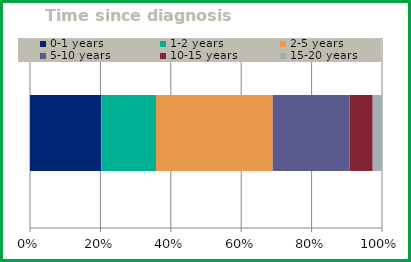
| Category | 0-1 years | 1-2 years | 2-5 years | 5-10 years | 10-15 years | 15-20 years |
|---|---|---|---|---|---|---|
| 0 | 77 | 59 | 126 | 83 | 25 | 10 |